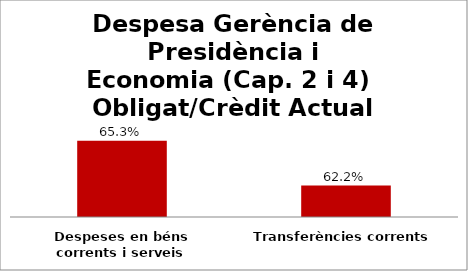
| Category | Series 0 |
|---|---|
| Despeses en béns corrents i serveis | 0.653 |
| Transferències corrents | 0.622 |